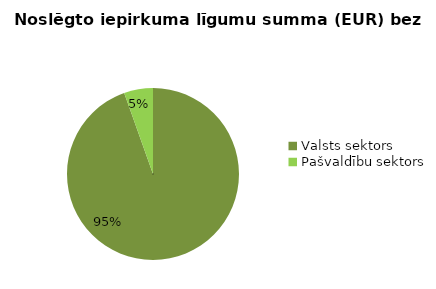
| Category | Noslēgto iepirkuma līgumu summa (EUR) bez PVN |
|---|---|
| Valsts sektors | 128700491 |
| Pašvaldību sektors | 7399138 |